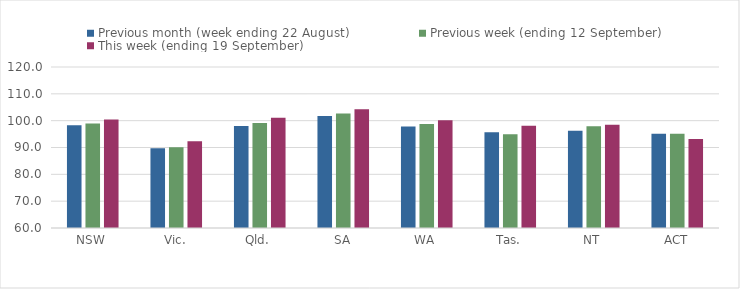
| Category | Previous month (week ending 22 August) | Previous week (ending 12 September) | This week (ending 19 September) |
|---|---|---|---|
| NSW | 98.27 | 98.92 | 100.42 |
| Vic. | 89.69 | 90.1 | 92.3 |
| Qld. | 98.02 | 99.13 | 101.07 |
| SA | 101.71 | 102.65 | 104.26 |
| WA | 97.85 | 98.72 | 100.16 |
| Tas. | 95.66 | 94.9 | 98.11 |
| NT | 96.22 | 97.96 | 98.5 |
| ACT | 95.13 | 95.13 | 93.2 |